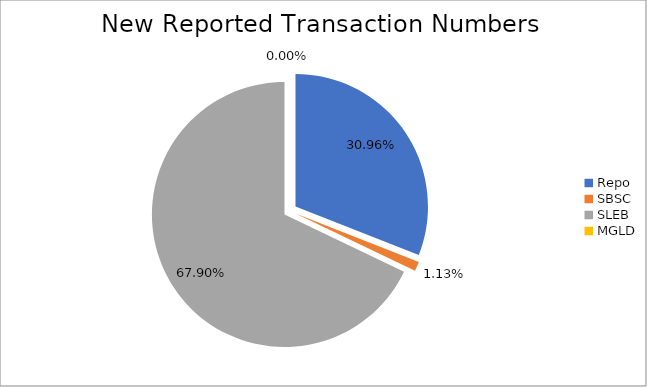
| Category | Series 0 |
|---|---|
| Repo | 318793 |
| SBSC | 11680 |
| SLEB | 699120 |
| MGLD | 28 |